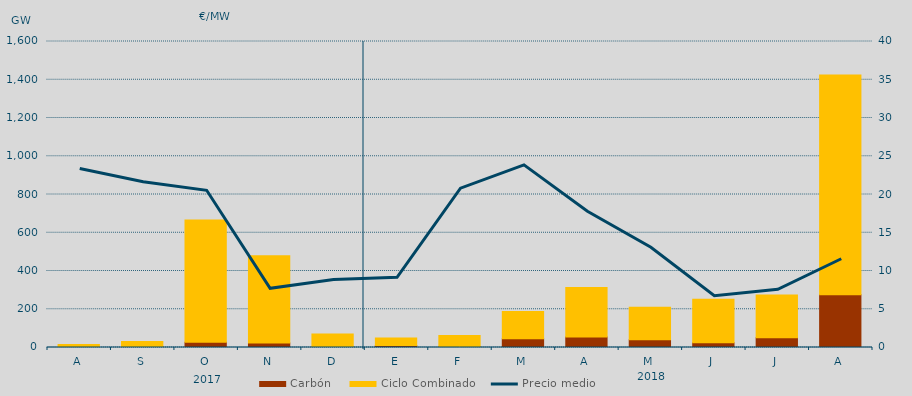
| Category | Carbón | Ciclo Combinado |
|---|---|---|
| A | 0 | 15430.5 |
| S | 3306.6 | 27967.5 |
| O | 27914.4 | 638167.2 |
| N | 23926.9 | 455734.5 |
| D | 3200.6 | 67420.5 |
| E | 10696.2 | 39454.7 |
| F | 4341.9 | 58215.4 |
| M | 45246.3 | 142680.5 |
| A | 55123 | 258682.2 |
| M | 40054.5 | 170347.3 |
| J | 24939.8 | 227127.5 |
| J | 50362.4 | 224750.8 |
| A | 276044.1 | 1148967.5 |